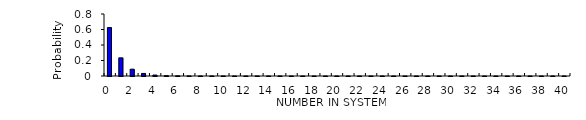
| Category | Series 0 |
|---|---|
| 0.0 | 0.625 |
| 1.0 | 0.234 |
| 2.0 | 0.088 |
| 3.0 | 0.033 |
| 4.0 | 0.012 |
| 5.0 | 0.005 |
| 6.0 | 0.002 |
| 7.0 | 0.001 |
| 8.0 | 0 |
| 9.0 | 0 |
| 10.0 | 0 |
| 11.0 | 0 |
| 12.0 | 0 |
| 13.0 | 0 |
| 14.0 | 0 |
| 15.0 | 0 |
| 16.0 | 0 |
| 17.0 | 0 |
| 18.0 | 0 |
| 19.0 | 0 |
| 20.0 | 0 |
| 21.0 | 0 |
| 22.0 | 0 |
| 23.0 | 0 |
| 24.0 | 0 |
| 25.0 | 0 |
| 26.0 | 0 |
| 27.0 | 0 |
| 28.0 | 0 |
| 29.0 | 0 |
| 30.0 | 0 |
| 31.0 | 0 |
| 32.0 | 0 |
| 33.0 | 0 |
| 34.0 | 0 |
| 35.0 | 0 |
| 36.0 | 0 |
| 37.0 | 0 |
| 38.0 | 0 |
| 39.0 | 0 |
| 40.0 | 0 |